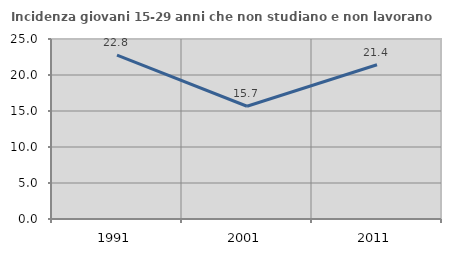
| Category | Incidenza giovani 15-29 anni che non studiano e non lavorano  |
|---|---|
| 1991.0 | 22.756 |
| 2001.0 | 15.657 |
| 2011.0 | 21.418 |